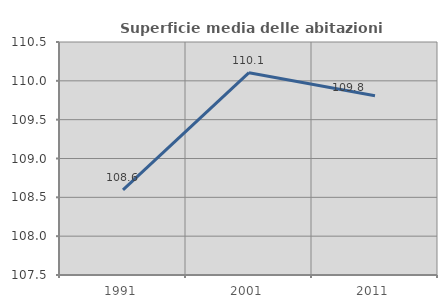
| Category | Superficie media delle abitazioni occupate |
|---|---|
| 1991.0 | 108.597 |
| 2001.0 | 110.105 |
| 2011.0 | 109.808 |